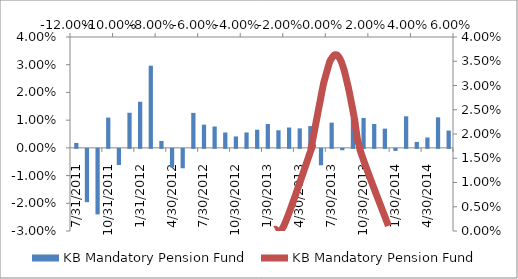
| Category | KB Mandatory Pension Fund |
|---|---|
| 31/07/2011 | 0.002 |
| 31/08/2011 | -0.019 |
| 30/09/2011 | -0.024 |
| 31/10/2011 | 0.011 |
| 30/11/2011 | -0.006 |
| 31/12/2011 | 0.013 |
| 31/01/2012 | 0.017 |
| 29/02/2012 | 0.03 |
| 31/03/2012 | 0.002 |
| 30/04/2012 | -0.007 |
| 31/05/2012 | -0.007 |
| 30/06/2012 | 0.013 |
| 31/07/2012 | 0.008 |
| 31/08/2012 | 0.008 |
| 30/09/2012 | 0.006 |
| 31/10/2012 | 0.004 |
| 30/11/2012 | 0.006 |
| 31/12/2012 | 0.007 |
| 31/01/2013 | 0.009 |
| 28/02/2013 | 0.006 |
| 31/03/2013 | 0.007 |
| 30/04/2013 | 0.007 |
| 31/05/2013 | 0.008 |
| 30/06/2013 | -0.006 |
| 31/07/2013 | 0.009 |
| 31/08/2013 | 0 |
| 30/09/2013 | 0.011 |
| 31/10/2013 | 0.011 |
| 30/11/2013 | 0.009 |
| 31/12/2013 | 0.007 |
| 31/01/2014 | -0.001 |
| 28/02/2014 | 0.011 |
| 31/03/2014 | 0.002 |
| 30/04/2014 | 0.004 |
| 31/05/2014 | 0.011 |
| 30/06/2014 | 0.006 |